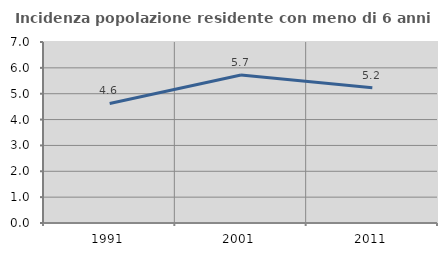
| Category | Incidenza popolazione residente con meno di 6 anni |
|---|---|
| 1991.0 | 4.622 |
| 2001.0 | 5.721 |
| 2011.0 | 5.233 |